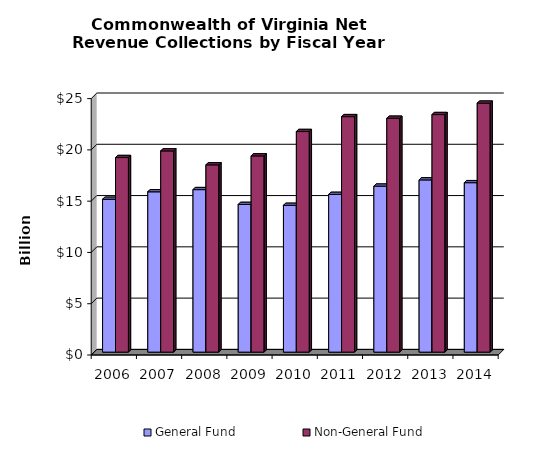
| Category | General Fund | Non-General Fund  |
|---|---|---|
| 2006.0 | 14.904 | 18.971 |
| 2007.0 | 15.633 | 19.618 |
| 2008.0 | 15.845 | 18.257 |
| 2009.0 | 14.398 | 19.134 |
| 2010.0 | 14.31 | 21.508 |
| 2011.0 | 15.379 | 22.96 |
| 2012.0 | 16.182 | 22.803 |
| 2013.0 | 16.792 | 23.162 |
| 2014.0 | 16.52 | 24.275 |